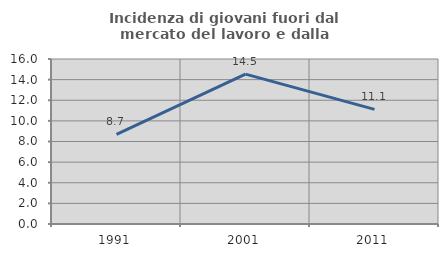
| Category | Incidenza di giovani fuori dal mercato del lavoro e dalla formazione  |
|---|---|
| 1991.0 | 8.698 |
| 2001.0 | 14.528 |
| 2011.0 | 11.116 |